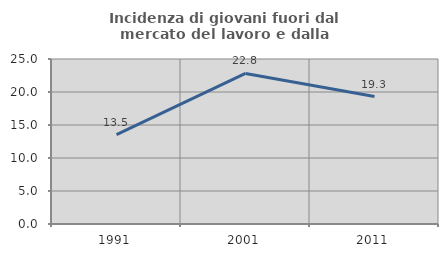
| Category | Incidenza di giovani fuori dal mercato del lavoro e dalla formazione  |
|---|---|
| 1991.0 | 13.533 |
| 2001.0 | 22.812 |
| 2011.0 | 19.307 |